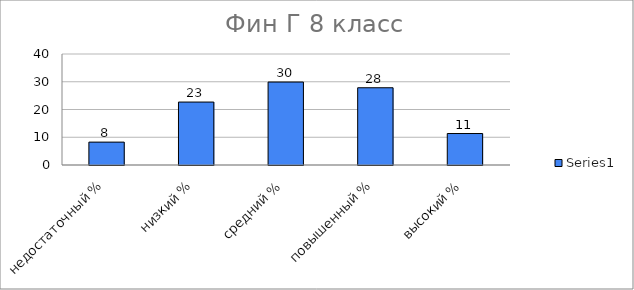
| Category | Series 0 |
|---|---|
| недостаточный % | 8.247 |
| низкий % | 22.68 |
| средний % | 29.897 |
| повышенный % | 27.835 |
| высокий % | 11.34 |